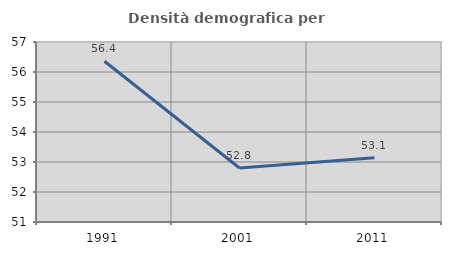
| Category | Densità demografica |
|---|---|
| 1991.0 | 56.358 |
| 2001.0 | 52.801 |
| 2011.0 | 53.14 |